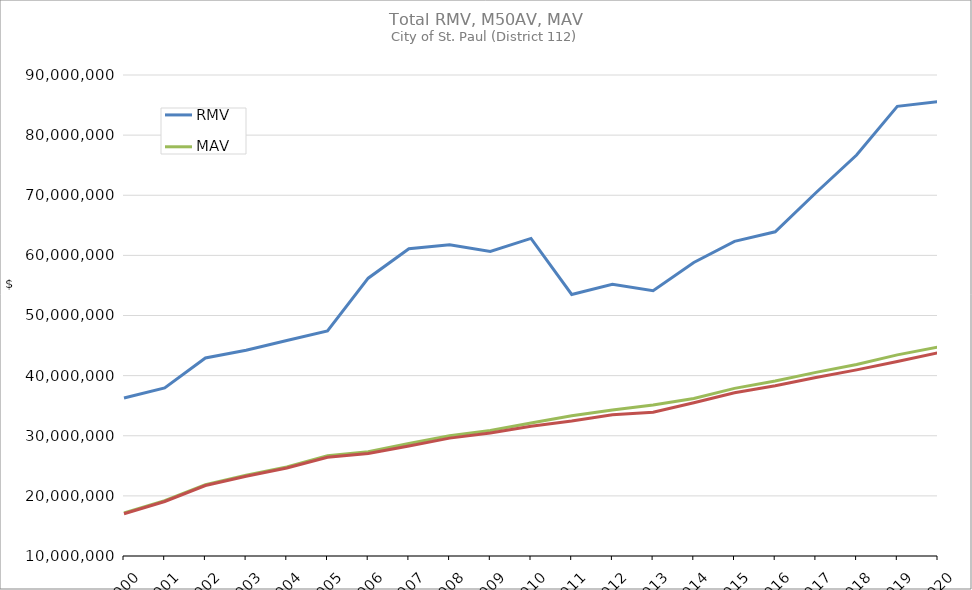
| Category | RMV | MAV | M50AV |
|---|---|---|---|
| 2000.0 | 36273765 | 17153147 | 17024795 |
| 2001.0 | 37946321 | 19188055 | 19066185 |
| 2002.0 | 42936588 | 21864236 | 21724224 |
| 2003.0 | 44209524 | 23427352 | 23268656 |
| 2004.0 | 45836349 | 24813051 | 24644021 |
| 2005.0 | 47419333 | 26684227 | 26410413 |
| 2006.0 | 56205692 | 27339762 | 27041944 |
| 2007.0 | 61103083 | 28700743 | 28302411 |
| 2008.0 | 61760335 | 29997894 | 29607315 |
| 2009.0 | 60662935 | 30861629 | 30443105 |
| 2010.0 | 62817134 | 32113964 | 31579558 |
| 2011.0 | 53503202 | 33330822 | 32454754 |
| 2012.0 | 55206920 | 34292652 | 33508723 |
| 2013.0 | 54111287 | 35131582 | 33902286 |
| 2014.0 | 58829207 | 36201261 | 35496988 |
| 2015.0 | 62337432 | 37876642 | 37164680 |
| 2016.0 | 63919596 | 39093405 | 38307305 |
| 2017.0 | 70413853 | 40543716 | 39677682 |
| 2018.0 | 76682623 | 41863804 | 40960307 |
| 2019.0 | 84783182 | 43446669 | 42351035 |
| 2020.0 | 85586075 | 44763179 | 43794419 |